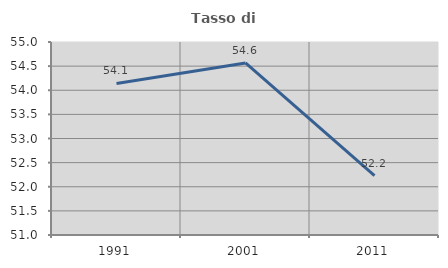
| Category | Tasso di occupazione   |
|---|---|
| 1991.0 | 54.142 |
| 2001.0 | 54.565 |
| 2011.0 | 52.229 |